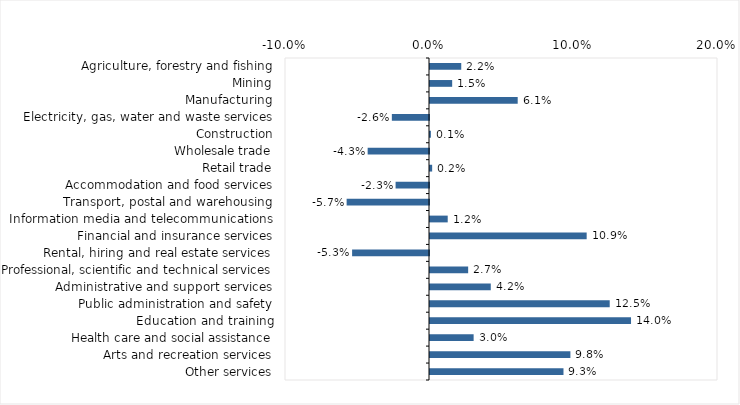
| Category | This week |
|---|---|
| Agriculture, forestry and fishing | 0.022 |
| Mining | 0.015 |
| Manufacturing | 0.061 |
| Electricity, gas, water and waste services | -0.026 |
| Construction | 0.001 |
| Wholesale trade | -0.043 |
| Retail trade | 0.002 |
| Accommodation and food services | -0.023 |
| Transport, postal and warehousing | -0.057 |
| Information media and telecommunications | 0.012 |
| Financial and insurance services | 0.109 |
| Rental, hiring and real estate services | -0.053 |
| Professional, scientific and technical services | 0.026 |
| Administrative and support services | 0.042 |
| Public administration and safety | 0.125 |
| Education and training | 0.14 |
| Health care and social assistance | 0.03 |
| Arts and recreation services | 0.098 |
| Other services | 0.093 |